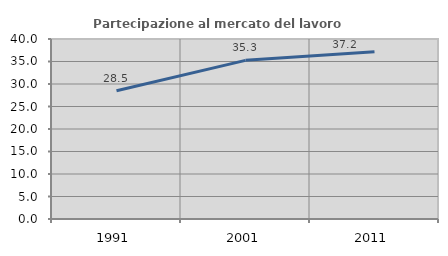
| Category | Partecipazione al mercato del lavoro  femminile |
|---|---|
| 1991.0 | 28.483 |
| 2001.0 | 35.256 |
| 2011.0 | 37.179 |